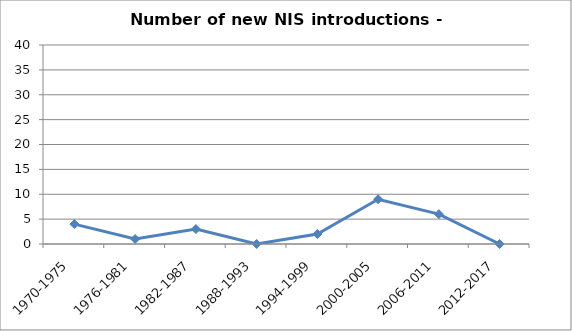
| Category | Number of new NIS introductions - Black Sea |
|---|---|
| 1970-1975 | 4 |
| 1976-1981 | 1 |
| 1982-1987 | 3 |
| 1988-1993 | 0 |
| 1994-1999 | 2 |
| 2000-2005 | 9 |
| 2006-2011 | 6 |
| 2012-2017 | 0 |